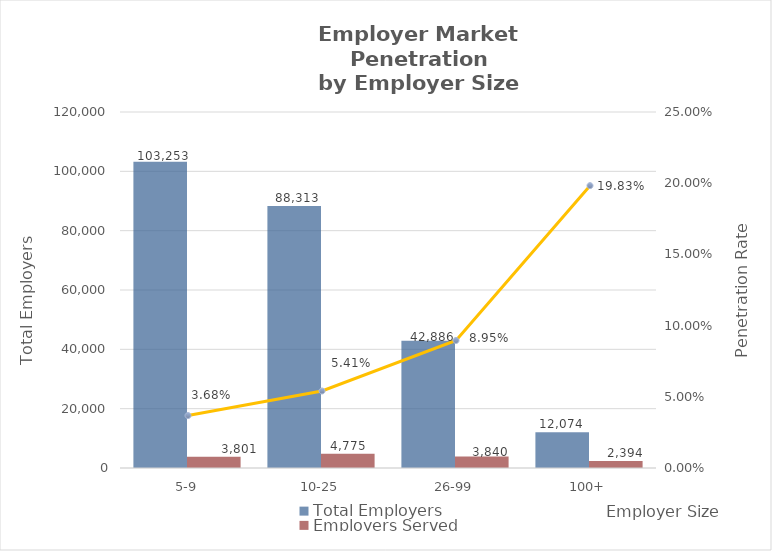
| Category | Total Employers | Employers Served |
|---|---|---|
| 5-9 | 103253 | 3801 |
| 10-25 | 88313 | 4775 |
| 26-99 | 42886 | 3840 |
| 100+ | 12074 | 2394 |